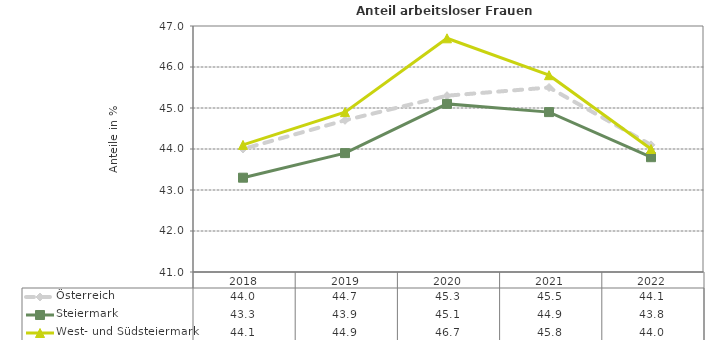
| Category | Österreich | Steiermark | West- und Südsteiermark |
|---|---|---|---|
| 2022.0 | 44.1 | 43.8 | 44 |
| 2021.0 | 45.5 | 44.9 | 45.8 |
| 2020.0 | 45.3 | 45.1 | 46.7 |
| 2019.0 | 44.7 | 43.9 | 44.9 |
| 2018.0 | 44 | 43.3 | 44.1 |